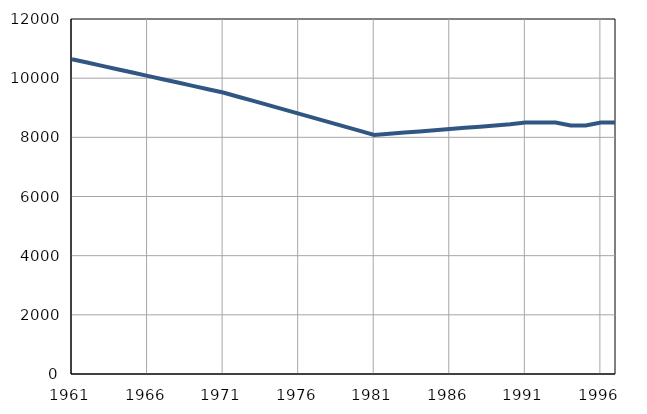
| Category | Број
становника |
|---|---|
| 1961.0 | 10642 |
| 1962.0 | 10529 |
| 1963.0 | 10416 |
| 1964.0 | 10303 |
| 1965.0 | 10190 |
| 1966.0 | 10077 |
| 1967.0 | 9964 |
| 1968.0 | 9851 |
| 1969.0 | 9738 |
| 1970.0 | 9625 |
| 1971.0 | 9516 |
| 1972.0 | 9373 |
| 1973.0 | 9230 |
| 1974.0 | 9087 |
| 1975.0 | 8944 |
| 1976.0 | 8801 |
| 1977.0 | 8658 |
| 1978.0 | 8515 |
| 1979.0 | 8372 |
| 1980.0 | 8229 |
| 1981.0 | 8081 |
| 1982.0 | 8121 |
| 1983.0 | 8161 |
| 1984.0 | 8201 |
| 1985.0 | 8241 |
| 1986.0 | 8281 |
| 1987.0 | 8321 |
| 1988.0 | 8361 |
| 1989.0 | 8401 |
| 1990.0 | 8441 |
| 1991.0 | 8500 |
| 1992.0 | 8500 |
| 1993.0 | 8500 |
| 1994.0 | 8400 |
| 1995.0 | 8400 |
| 1996.0 | 8500 |
| 1997.0 | 8500 |